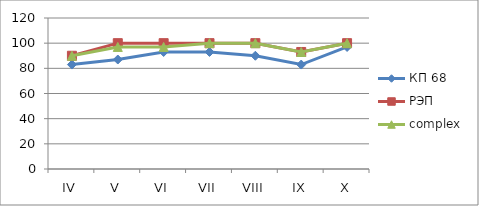
| Category | КП 68 | РЭП  | complex |
|---|---|---|---|
| IV | 83 | 90 | 90 |
| V | 87 | 100 | 97 |
| VI | 93 | 100 | 97 |
| VII | 93 | 100 | 100 |
| VIII | 90 | 100 | 100 |
| IX | 83 | 93 | 93 |
| X | 97 | 100 | 100 |